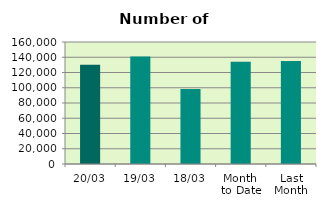
| Category | Series 0 |
|---|---|
| 20/03 | 130258 |
| 19/03 | 140932 |
| 18/03 | 98200 |
| Month 
to Date | 134027.143 |
| Last
Month | 135041.7 |